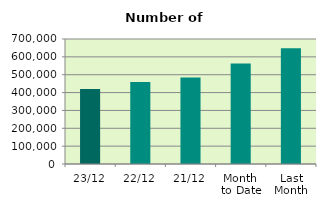
| Category | Series 0 |
|---|---|
| 23/12 | 419418 |
| 22/12 | 458934 |
| 21/12 | 484378 |
| Month 
to Date | 562154.706 |
| Last
Month | 647745.364 |